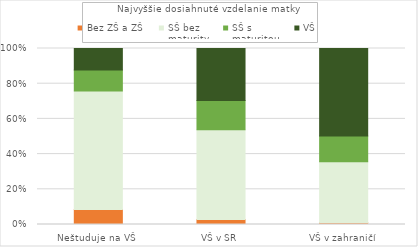
| Category | Bez ZŠ a ZŠ | SŠ bez
maturity | SŠ s
maturitou | VŠ |
|---|---|---|---|---|
| Neštuduje na VŠ | 1229 | 9757 | 1726 | 1774 |
| VŠ v SR | 493 | 8700 | 2839 | 5032 |
| VŠ v zahraničí | 36 | 1169 | 496 | 1685 |